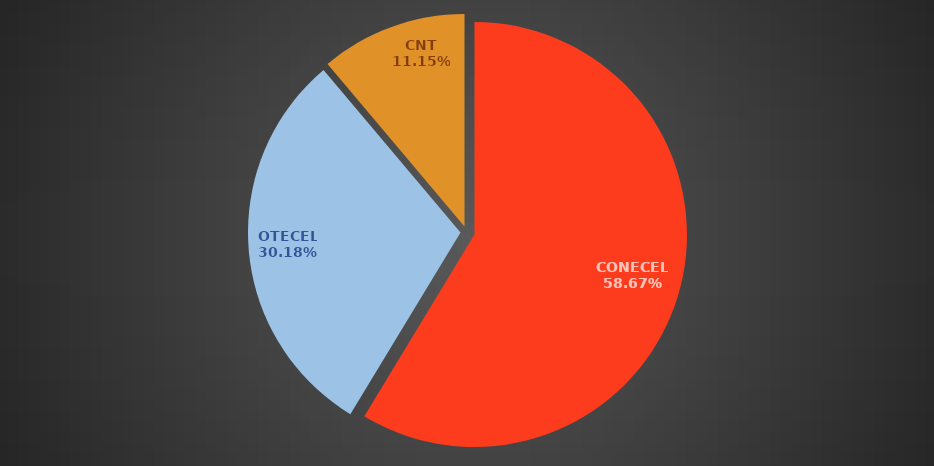
| Category | Jun 2107 |
|---|---|
| CONECEL | 8821576 |
| OTECEL | 4537153 |
| CNT | 1676146 |